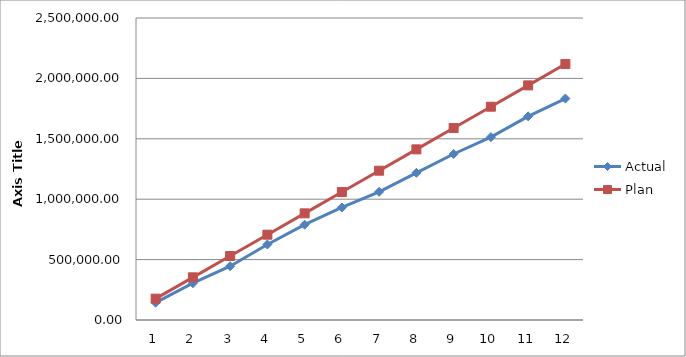
| Category | Actual | Plan |
|---|---|---|
| 0 | 143470.41 | 176566.833 |
| 1 | 304475.33 | 353133.667 |
| 2 | 445462.87 | 529700.5 |
| 3 | 625115.94 | 706267.333 |
| 4 | 789394.32 | 882834.167 |
| 5 | 931654.89 | 1059401 |
| 6 | 1060940.56 | 1235967.833 |
| 7 | 1218075.27 | 1412534.667 |
| 8 | 1374248.29 | 1589101.5 |
| 9 | 1513837.84 | 1765668.333 |
| 10 | 1685685.17 | 1942235.167 |
| 11 | 1833347.06 | 2118802 |